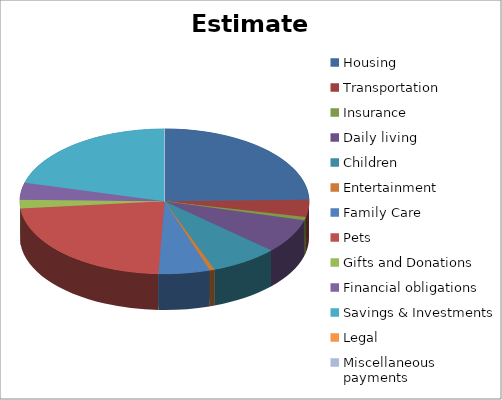
| Category | Estimated |
|---|---|
| Housing | 650 |
| Transportation | 100 |
| Insurance | 20 |
| Daily living | 200 |
| Children | 200 |
| Entertainment | 15 |
| Family Care | 150 |
| Pets | 600 |
| Gifts and Donations | 50 |
| Financial obligations | 100 |
| Savings & Investments | 550 |
| Legal | 0 |
| Miscellaneous payments | 0 |